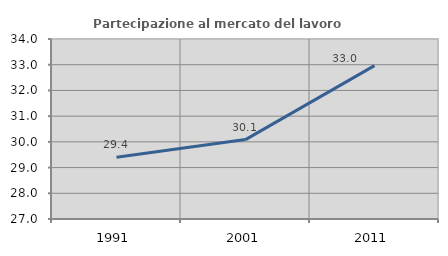
| Category | Partecipazione al mercato del lavoro  femminile |
|---|---|
| 1991.0 | 29.404 |
| 2001.0 | 30.088 |
| 2011.0 | 32.965 |